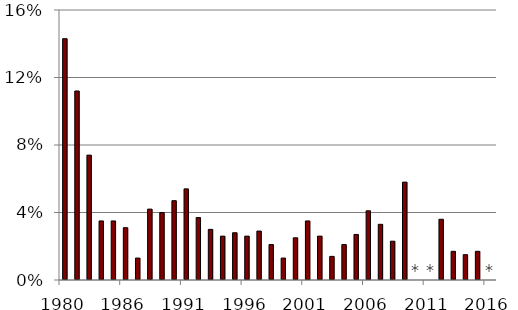
| Category | Series 0 |
|---|---|
| 1980.0 | 0.143 |
| 1981.0 | 0.112 |
| 1982.0 | 0.074 |
| 1984.0 | 0.035 |
| 1985.0 | 0.035 |
| 1986.0 | 0.031 |
| 1987.0 | 0.013 |
| 1988.0 | 0.042 |
| 1989.0 | 0.04 |
| 1990.0 | 0.047 |
| 1991.0 | 0.054 |
| 1992.0 | 0.037 |
| 1993.0 | 0.03 |
| 1994.0 | 0.026 |
| 1995.0 | 0.028 |
| 1996.0 | 0.026 |
| 1997.0 | 0.029 |
| 1998.0 | 0.021 |
| 1999.0 | 0.013 |
| 2000.0 | 0.025 |
| 2001.0 | 0.035 |
| 2002.0 | 0.026 |
| 2003.0 | 0.014 |
| 2004.0 | 0.021 |
| 2005.0 | 0.027 |
| 2006.0 | 0.041 |
| 2007.0 | 0.033 |
| 2008.0 | 0.023 |
| 2009.0 | 0.058 |
| 2010.0 | 0 |
| 2011.0 | 0 |
| 2012.0 | 0.036 |
| 2013.0 | 0.017 |
| 2014.0 | 0.015 |
| 2015.0 | 0.017 |
| 2016.0 | 0 |